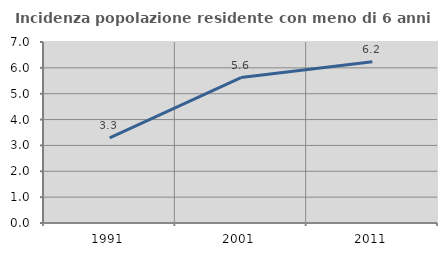
| Category | Incidenza popolazione residente con meno di 6 anni |
|---|---|
| 1991.0 | 3.289 |
| 2001.0 | 5.623 |
| 2011.0 | 6.233 |